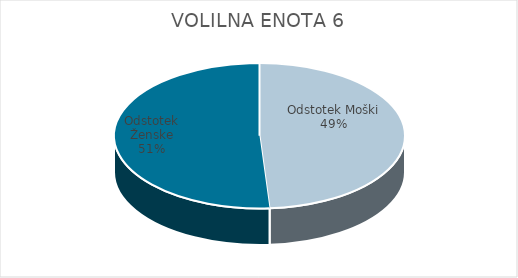
| Category | VOLILNA ENOTA 6 | #REF! | Slovenija skupaj |
|---|---|---|---|
| Odstotek Moški | 33.87 |  | 33.67 |
| Odstotek Ženske | 35.39 |  | 35.97 |